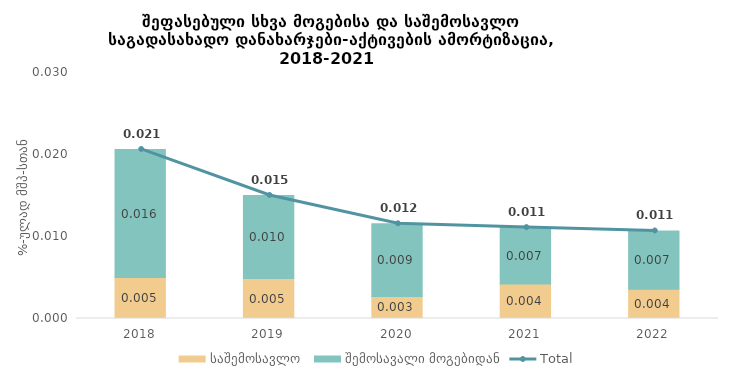
| Category | საშემოსავლო  | შემოსავალი მოგებიდან |
|---|---|---|
| 2018.0 | 0.005 | 0.016 |
| 2019.0 | 0.005 | 0.01 |
| 2020.0 | 0.003 | 0.009 |
| 2021.0 | 0.004 | 0.007 |
| 2022.0 | 0.004 | 0.007 |